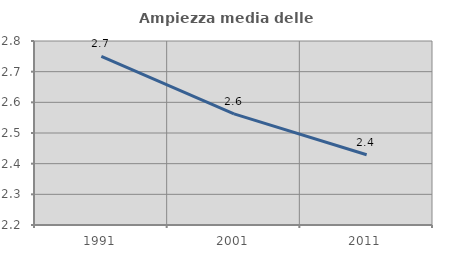
| Category | Ampiezza media delle famiglie |
|---|---|
| 1991.0 | 2.75 |
| 2001.0 | 2.562 |
| 2011.0 | 2.429 |